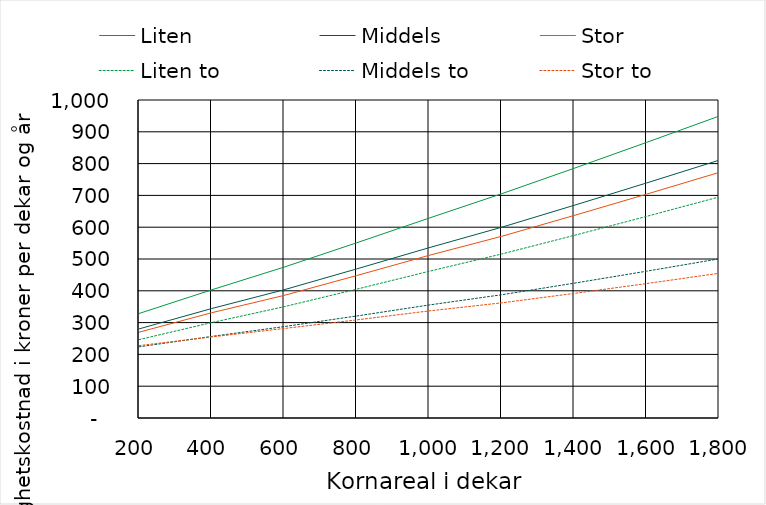
| Category | Liten | Middels | Stor | Liten to | Middels to | Stor to |
|---|---|---|---|---|---|---|
| 200.0 | 328.602 | 280.163 | 269.762 | 246.445 | 223.722 | 227.659 |
| 400.0 | 402.859 | 344.054 | 330.892 | 299.932 | 256.475 | 254.891 |
| 600.0 | 474.445 | 403.181 | 385.465 | 349.906 | 287.394 | 281.402 |
| 800.0 | 550.792 | 468.67 | 447.789 | 404.94 | 320.713 | 308.392 |
| 1000.0 | 628.454 | 535.475 | 511.43 | 461.289 | 355.348 | 336.697 |
| 1200.0 | 705.066 | 599.702 | 571.178 | 515.58 | 387.468 | 362.039 |
| 1400.0 | 785.13 | 668.695 | 636.824 | 574.101 | 423.848 | 391.726 |
| 1600.0 | 866.51 | 739.004 | 703.787 | 633.938 | 461.543 | 422.729 |
| 1800.0 | 949.205 | 810.629 | 772.065 | 695.091 | 500.554 | 455.048 |